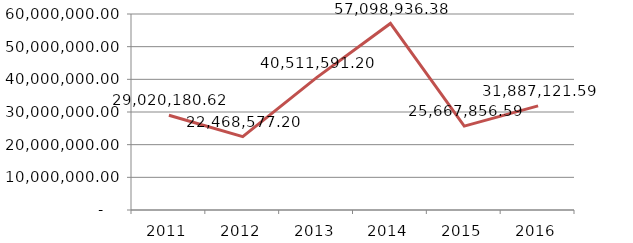
| Category | Total |
|---|---|
| 2011.0 | 29020180.616 |
| 2012.0 | 22468577.2 |
| 2013.0 | 40511591.2 |
| 2014.0 | 57098936.375 |
| 2015.0 | 25667856.59 |
| 2016.0 | 31887121.59 |